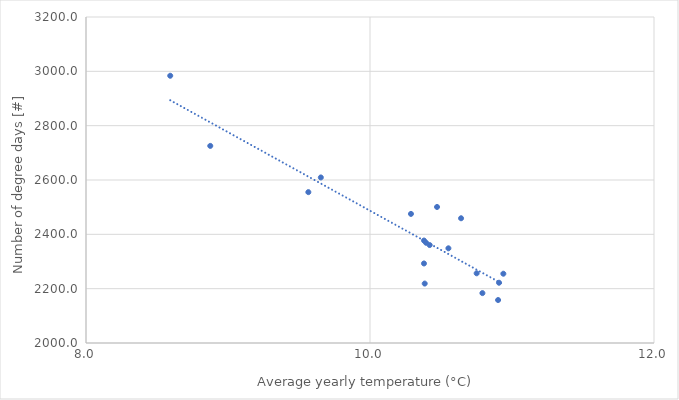
| Category | Series 0 |
|---|---|
| 8.87511415525114 | 2725.507 |
| 10.3852968036529 | 2218.768 |
| 10.7916894977168 | 2183.638 |
| 10.9020776255707 | 2158.172 |
| 9.56584474885844 | 2555.307 |
| 10.5521461187214 | 2348.56 |
| 9.65369863013698 | 2609.378 |
| 10.6413242009132 | 2459.161 |
| 10.4720662100456 | 2500.736 |
| 8.5931506849315 | 2983.732 |
| 10.288504566210046 | 2475.2 |
| 10.4202397260273 | 2360.556 |
| 10.9390753424657 | 2255.015 |
| 10.9084703196347 | 2221.869 |
| 10.3947260273972 | 2368.982 |
| 10.7510958904109 | 2256.556 |
| 10.3803652968036 | 2377.14 |
| 10.3801369863013 | 2292.769 |